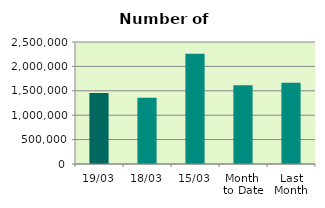
| Category | Series 0 |
|---|---|
| 19/03 | 1454226 |
| 18/03 | 1358772 |
| 15/03 | 2258068 |
| Month 
to Date | 1613824.462 |
| Last
Month | 1666801.1 |